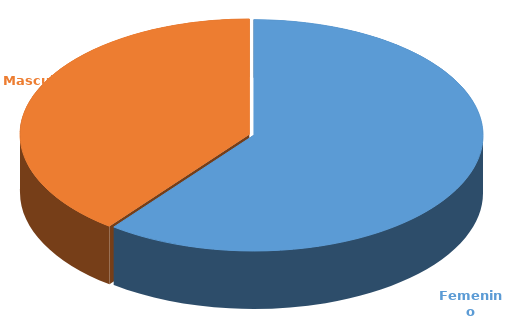
| Category | Cantidad  |
|---|---|
| Femenino | 3810 |
| Masculino | 2494 |